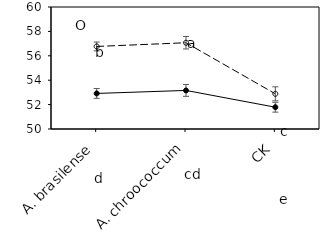
| Category | aCO2 | eCO2 |
|---|---|---|
|    A. brasilense | 52.914 | 56.766 |
|    A. chroococcum | 53.161 | 57.071 |
| CK | 51.785 | 52.884 |